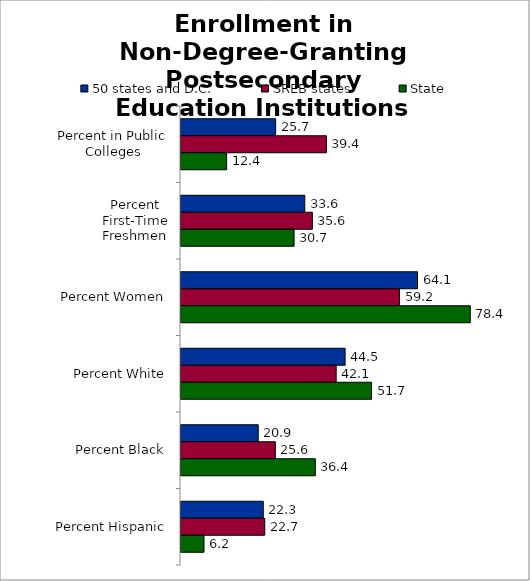
| Category | 50 states and D.C. | SREB states | State |
|---|---|---|---|
| 0 | 25.658 | 39.419 | 12.37 |
| 1 | 33.553 | 35.614 | 30.655 |
| 2 | 64.114 | 59.245 | 78.425 |
| 3 | 44.489 | 42.066 | 51.661 |
| 4 | 20.935 | 25.572 | 36.413 |
| 5 | 22.302 | 22.711 | 6.232 |